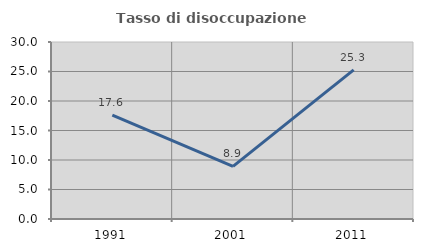
| Category | Tasso di disoccupazione giovanile  |
|---|---|
| 1991.0 | 17.611 |
| 2001.0 | 8.911 |
| 2011.0 | 25.263 |